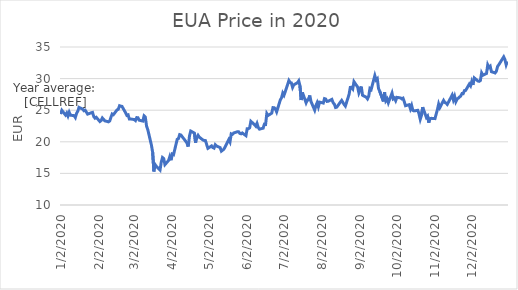
| Category | Price |
|---|---|
| 12/31/20 | 32.72 |
| 12/30/20 | 32.19 |
| 12/29/20 | 33.02 |
| 12/28/20 | 33.44 |
| 12/24/20 | 32.19 |
| 12/23/20 | 31.92 |
| 12/22/20 | 31.15 |
| 12/21/20 | 30.89 |
| 12/18/20 | 31.1 |
| 12/17/20 | 31.96 |
| 12/16/20 | 31.78 |
| 12/15/20 | 32.18 |
| 12/14/20 | 30.81 |
| 12/11/20 | 30.52 |
| 12/10/20 | 30.9 |
| 12/9/20 | 29.7 |
| 12/8/20 | 29.57 |
| 12/7/20 | 29.62 |
| 12/4/20 | 30.11 |
| 12/3/20 | 29 |
| 12/2/20 | 29.55 |
| 12/1/20 | 28.86 |
| 11/30/20 | 29.14 |
| 11/27/20 | 28.13 |
| 11/26/20 | 28.1 |
| 11/25/20 | 27.62 |
| 11/24/20 | 27.63 |
| 11/23/20 | 27.25 |
| 11/20/20 | 26.74 |
| 11/19/20 | 26.35 |
| 11/18/20 | 27.19 |
| 11/17/20 | 26.64 |
| 11/16/20 | 27.39 |
| 11/13/20 | 26.28 |
| 11/12/20 | 25.92 |
| 11/11/20 | 26.13 |
| 11/10/20 | 26.23 |
| 11/9/20 | 26.55 |
| 11/6/20 | 25.42 |
| 11/5/20 | 25.98 |
| 11/4/20 | 25.11 |
| 11/3/20 | 24.39 |
| 11/2/20 | 23.67 |
| 10/30/20 | 23.71 |
| 10/29/20 | 23.67 |
| 10/28/20 | 23.03 |
| 10/27/20 | 24.07 |
| 10/26/20 | 23.85 |
| 10/23/20 | 25.49 |
| 10/22/20 | 24.18 |
| 10/21/20 | 23.56 |
| 10/20/20 | 24.41 |
| 10/19/20 | 24.98 |
| 10/16/20 | 24.89 |
| 10/15/20 | 24.96 |
| 10/14/20 | 25.75 |
| 10/13/20 | 25.22 |
| 10/12/20 | 25.87 |
| 10/9/20 | 25.71 |
| 10/8/20 | 26.34 |
| 10/7/20 | 26.9 |
| 10/6/20 | 26.79 |
| 10/5/20 | 26.94 |
| 10/2/20 | 27.03 |
| 10/1/20 | 26.51 |
| 9/30/20 | 26.93 |
| 9/29/20 | 26.79 |
| 9/28/20 | 27.71 |
| 9/25/20 | 26.17 |
| 9/24/20 | 26.79 |
| 9/23/20 | 26.5 |
| 9/22/20 | 27.85 |
| 9/21/20 | 26.4 |
| 9/18/20 | 27.99 |
| 9/17/20 | 28.43 |
| 9/16/20 | 29.99 |
| 9/15/20 | 29.79 |
| 9/14/20 | 30.47 |
| 9/11/20 | 28.26 |
| 9/10/20 | 28.42 |
| 9/9/20 | 27.2 |
| 9/8/20 | 26.79 |
| 9/7/20 | 27.05 |
| 9/4/20 | 27.36 |
| 9/3/20 | 28.74 |
| 9/2/20 | 28.23 |
| 9/1/20 | 27.74 |
| 8/31/20 | 28.66 |
| 8/28/20 | 29.52 |
| 8/27/20 | 28.37 |
| 8/26/20 | 28.62 |
| 8/25/20 | 28.61 |
| 8/24/20 | 27.48 |
| 8/21/20 | 25.65 |
| 8/20/20 | 25.9 |
| 8/19/20 | 26.23 |
| 8/18/20 | 26.55 |
| 8/17/20 | 26.3 |
| 8/14/20 | 25.48 |
| 8/13/20 | 25.43 |
| 8/12/20 | 25.97 |
| 8/11/20 | 26.19 |
| 8/10/20 | 26.71 |
| 8/7/20 | 26.42 |
| 8/6/20 | 26.39 |
| 8/5/20 | 26.77 |
| 8/4/20 | 26.83 |
| 8/3/20 | 26.13 |
| 7/31/20 | 26.28 |
| 7/30/20 | 25.54 |
| 7/29/20 | 26.19 |
| 7/28/20 | 25.74 |
| 7/27/20 | 25.01 |
| 7/24/20 | 26.37 |
| 7/23/20 | 27.33 |
| 7/22/20 | 26.63 |
| 7/21/20 | 26.61 |
| 7/20/20 | 26.17 |
| 7/17/20 | 27.82 |
| 7/16/20 | 26.61 |
| 7/15/20 | 28.85 |
| 7/14/20 | 29.64 |
| 7/13/20 | 29.35 |
| 7/10/20 | 29.02 |
| 7/9/20 | 28.61 |
| 7/8/20 | 29.32 |
| 7/7/20 | 29.39 |
| 7/6/20 | 29.7 |
| 7/3/20 | 27.91 |
| 7/2/20 | 27.37 |
| 7/1/20 | 27.71 |
| 6/30/20 | 26.97 |
| 6/29/20 | 26.63 |
| 6/26/20 | 24.73 |
| 6/25/20 | 25.18 |
| 6/24/20 | 25.4 |
| 6/23/20 | 25.41 |
| 6/22/20 | 24.53 |
| 6/19/20 | 24.16 |
| 6/18/20 | 24.47 |
| 6/17/20 | 22.75 |
| 6/16/20 | 22.78 |
| 6/15/20 | 22.16 |
| 6/12/20 | 22 |
| 6/11/20 | 22.27 |
| 6/10/20 | 22.91 |
| 6/9/20 | 22.48 |
| 6/8/20 | 22.71 |
| 6/5/20 | 23.24 |
| 6/4/20 | 22.21 |
| 6/3/20 | 22.08 |
| 6/2/20 | 22.07 |
| 6/1/20 | 20.97 |
| 5/29/20 | 21.4 |
| 5/28/20 | 21.26 |
| 5/27/20 | 21.33 |
| 5/26/20 | 21.6 |
| 5/25/20 | 21.59 |
| 5/22/20 | 21.4 |
| 5/21/20 | 21.18 |
| 5/20/20 | 21.26 |
| 5/19/20 | 19.97 |
| 5/18/20 | 20.34 |
| 5/15/20 | 19.17 |
| 5/14/20 | 18.84 |
| 5/13/20 | 18.67 |
| 5/12/20 | 18.52 |
| 5/11/20 | 19.07 |
| 5/8/20 | 19.35 |
| 5/7/20 | 19.54 |
| 5/6/20 | 19 |
| 5/5/20 | 19.09 |
| 5/4/20 | 19.35 |
| 5/1/20 | 18.97 |
| 4/30/20 | 19.57 |
| 4/29/20 | 20.19 |
| 4/28/20 | 20.21 |
| 4/27/20 | 20.28 |
| 4/24/20 | 20.74 |
| 4/23/20 | 21.03 |
| 4/22/20 | 20.66 |
| 4/21/20 | 19.85 |
| 4/20/20 | 21.38 |
| 4/17/20 | 21.7 |
| 4/16/20 | 20.94 |
| 4/15/20 | 19.25 |
| 4/14/20 | 19.81 |
| 4/9/20 | 21.08 |
| 4/8/20 | 21.14 |
| 4/7/20 | 20.51 |
| 4/6/20 | 20.4 |
| 4/3/20 | 17.96 |
| 4/2/20 | 18.06 |
| 4/1/20 | 17.08 |
| 3/31/20 | 17.68 |
| 3/30/20 | 17.06 |
| 3/27/20 | 16.39 |
| 3/26/20 | 17.35 |
| 3/25/20 | 17.51 |
| 3/24/20 | 16.78 |
| 3/23/20 | 15.54 |
| 3/20/20 | 16.11 |
| 3/19/20 | 16.39 |
| 3/18/20 | 15.3 |
| 3/17/20 | 18.31 |
| 3/16/20 | 19.47 |
| 3/13/20 | 21.94 |
| 3/12/20 | 22.52 |
| 3/11/20 | 23.92 |
| 3/10/20 | 24.1 |
| 3/9/20 | 23.28 |
| 3/6/20 | 23.42 |
| 3/5/20 | 23.81 |
| 3/4/20 | 23.83 |
| 3/3/20 | 23.36 |
| 3/2/20 | 23.52 |
| 2/28/20 | 23.61 |
| 2/27/20 | 23.6 |
| 2/26/20 | 24.26 |
| 2/25/20 | 24.18 |
| 2/24/20 | 24.57 |
| 2/21/20 | 25.61 |
| 2/20/20 | 25.64 |
| 2/19/20 | 25.71 |
| 2/18/20 | 25.14 |
| 2/17/20 | 25.05 |
| 2/14/20 | 24.29 |
| 2/13/20 | 24.4 |
| 2/12/20 | 23.88 |
| 2/11/20 | 23.3 |
| 2/10/20 | 23.16 |
| 2/7/20 | 23.32 |
| 2/6/20 | 23.56 |
| 2/5/20 | 23.77 |
| 2/4/20 | 23.36 |
| 2/3/20 | 23.21 |
| 1/31/20 | 23.88 |
| 1/30/20 | 23.74 |
| 1/29/20 | 23.99 |
| 1/28/20 | 24.65 |
| 1/27/20 | 24.59 |
| 1/24/20 | 24.38 |
| 1/23/20 | 24.7 |
| 1/22/20 | 25.01 |
| 1/21/20 | 24.92 |
| 1/20/20 | 25.17 |
| 1/17/20 | 25.44 |
| 1/16/20 | 24.85 |
| 1/15/20 | 24.51 |
| 1/14/20 | 23.84 |
| 1/13/20 | 24.14 |
| 1/10/20 | 24.21 |
| 1/9/20 | 24.67 |
| 1/8/20 | 24.08 |
| 1/7/20 | 24.55 |
| 1/6/20 | 24.23 |
| 1/3/20 | 24.98 |
| 1/2/20 | 24.39 |